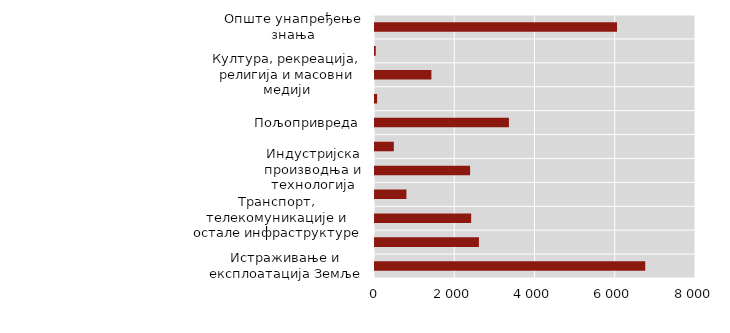
| Category | Series 0 |
|---|---|
| Истраживање и експлоатација Земље | 6735 |
| Очување животне средине | 2590 |
| Транспорт, телекомуникације и остале инфраструктуре | 2397 |
| Енергија | 783 |
| Индустријска производња и технологија | 2370 |
| Здравство | 469 |
| Пољопривреда | 3338 |
| Образовање | 53 |
| Култура, рекреација, религија и масовни медији | 1405 |
| Политички и друштвени системи, структуре и процеси | 19 |
| Опште унапређење знања | 6032 |